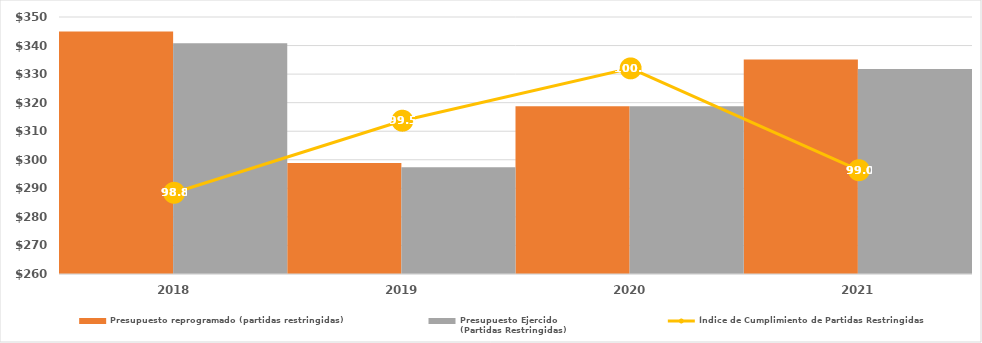
| Category | Presupuesto reprogramado (partidas restringidas) | Presupuesto Ejercido
(Partidas Restringidas) |
|---|---|---|
| 2018.0 | 344938.7 | 340765 |
| 2019.0 | 298904.428 | 297383.7 |
| 2020.0 | 318785.247 | 318785.247 |
| 2021.0 | 335107.39 | 331789.211 |